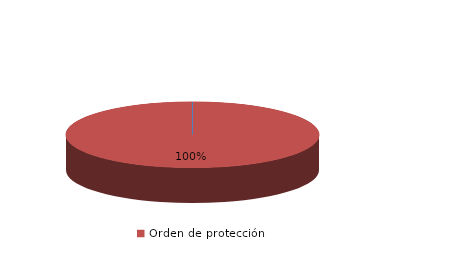
| Category | Series 0 |
|---|---|
| Orden de alejamiento | 0 |
| Orden de protección | 34 |